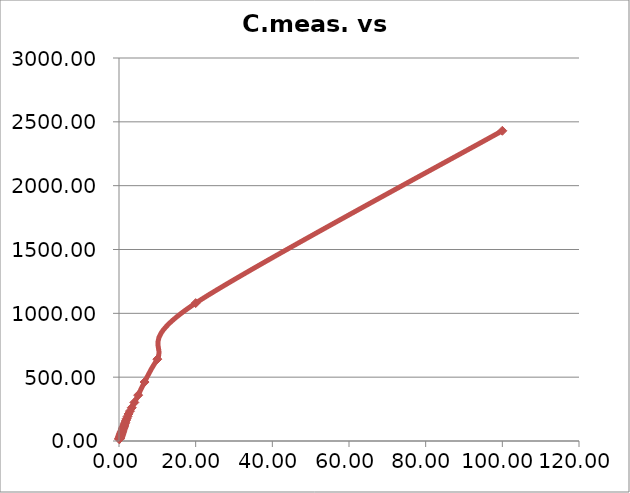
| Category | C.meas. vs 1/d |
|---|---|
| 100.0 | 2430 |
| 20.0 | 1080 |
| 10.0 | 641 |
| 6.666666666666667 | 462 |
| 5.0 | 359 |
| 4.0 | 302 |
| 3.333333333333333 | 261 |
| 2.857142857142857 | 234 |
| 2.5 | 212 |
| 2.222222222222222 | 192 |
| 2.0 | 175 |
| 1.818181818181818 | 161 |
| 1.666666666666667 | 147 |
| 1.538461538461538 | 136 |
| 1.428571428571429 | 126 |
| 1.333333333333333 | 118 |
| 1.25 | 112 |
| 1.176470588235294 | 106.4 |
| 1.111111111111111 | 101.6 |
| 1.052631578947368 | 97 |
| 1.0 | 92.7 |
| 0.909090909090909 | 84.5 |
| 0.833333333333333 | 77.5 |
| 0.769230769230769 | 72.2 |
| 0.714285714285714 | 67.9 |
| 0.666666666666667 | 64 |
| 0.625 | 60.3 |
| 0.588235294117647 | 56.8 |
| 0.555555555555556 | 54.1 |
| 0.526315789473684 | 51.8 |
| 0.5 | 49.6 |
| 0.454545454545454 | 45.4 |
| 0.416666666666667 | 42.2 |
| 0.384615384615385 | 39.4 |
| 0.357142857142857 | 36.9 |
| 0.333333333333333 | 34.9 |
| 0.285714285714286 | 30.6 |
| 0.25 | 27.4 |
| 0.222222222222222 | 24.8 |
| 0.2 | 22.8 |
| 0.181818181818182 | 21.1 |
| 0.166666666666667 | 19.7 |
| 0.153846153846154 | 18.5 |
| 0.142857142857143 | 17.4 |
| 0.133333333333333 | 16.5 |
| 0.125 | 15.7 |
| 0.117647058823529 | 15 |
| 0.111111111111111 | 14.9 |
| 0.105263157894737 | 14.9 |
| 0.1 | 14.9 |